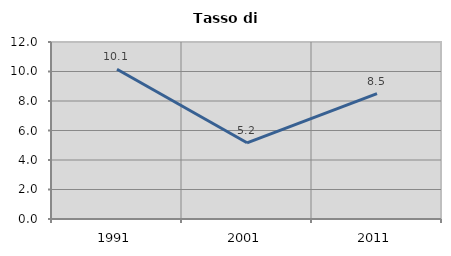
| Category | Tasso di disoccupazione   |
|---|---|
| 1991.0 | 10.15 |
| 2001.0 | 5.165 |
| 2011.0 | 8.5 |